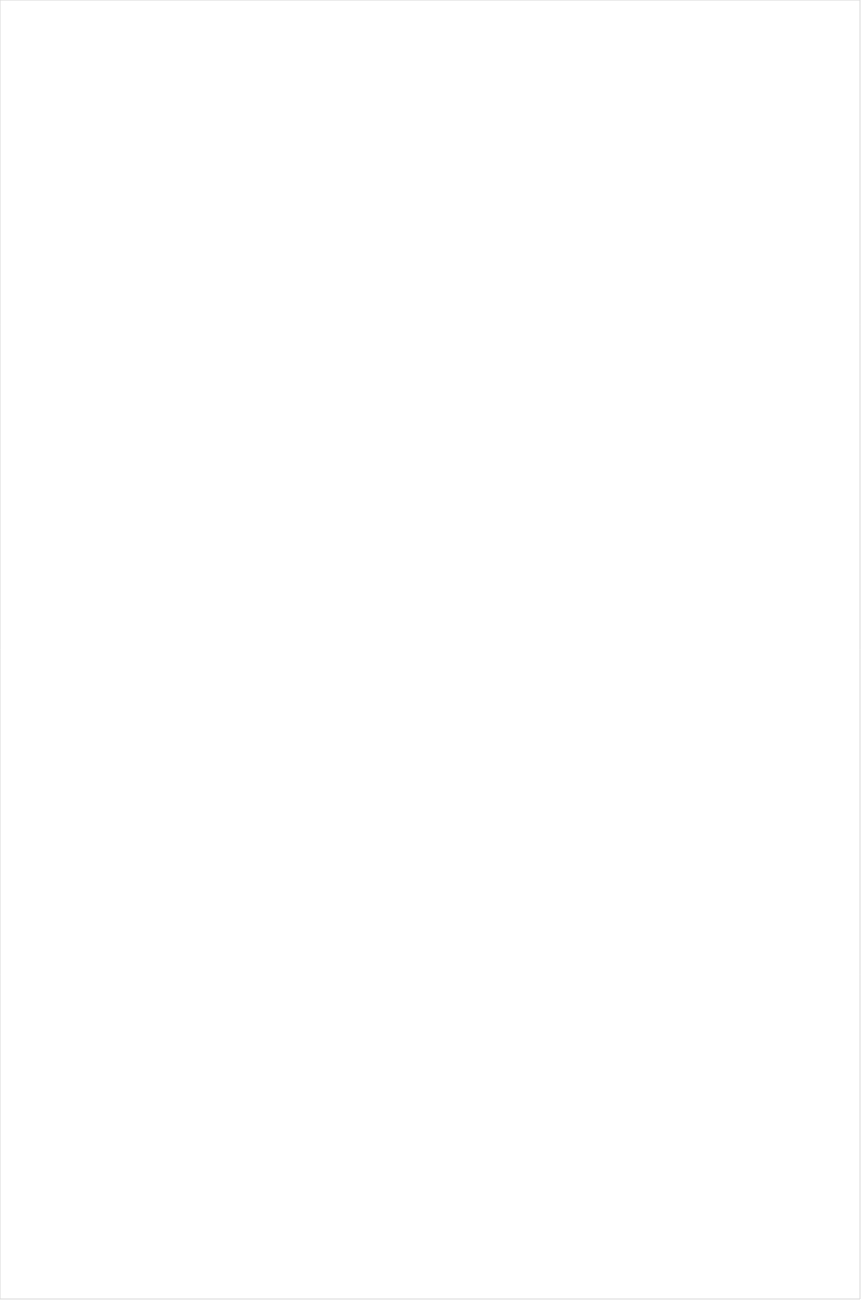
| Category | Total |
|---|---|
| UniMas | -0.543 |
| Hallmark Movies & Mysteries | -0.542 |
| Univision | -0.48 |
| RFD TV | -0.46 |
| Hallmark | -0.444 |
| Telemundo | -0.41 |
| Travel | -0.374 |
| PBS | -0.361 |
| National Geographic Wild | -0.343 |
| Galavision | -0.324 |
| UP TV | -0.276 |
| Science Channel | -0.273 |
| CMTV | -0.256 |
| MyNetworkTV | -0.236 |
| Fox News | -0.234 |
| Fox Business | -0.203 |
| The Sportsman Channel | -0.202 |
| CBS | -0.186 |
| Outdoor Channel | -0.174 |
| NBC Universo | -0.168 |
| Animal Planet | -0.165 |
| Weather Channel | -0.164 |
| TLC | -0.161 |
| Great American Country | -0.159 |
| INSP | -0.151 |
| ION | -0.143 |
| History Channel | -0.14 |
| Smithsonian | -0.131 |
| WGN America | -0.113 |
| Investigation Discovery | -0.108 |
| NBC | -0.105 |
| Cartoon Network | -0.105 |
| POP | -0.076 |
| Ovation | -0.07 |
| Discovery Life Channel | -0.066 |
| TV LAND | -0.06 |
| Discovery Channel | -0.058 |
| DIY | -0.055 |
| HGTV | -0.049 |
| Headline News | -0.048 |
| Discovery Family Channel | -0.044 |
| CW | -0.027 |
| Motor Trend Network | 0.002 |
| ABC | 0.011 |
| OXYGEN | 0.012 |
| FYI | 0.014 |
| FOX | 0.02 |
| Freeform | 0.035 |
| Nick@Nite | 0.07 |
| American Heroes Channel | 0.079 |
| Disney XD | 0.087 |
| Nick Toons | 0.09 |
| E! | 0.116 |
| Lifetime Movies | 0.13 |
| Food Network | 0.136 |
| BBC America | 0.148 |
| WE TV | 0.152 |
| Disney Junior US | 0.159 |
| BRAVO | 0.162 |
| Universal Kids | 0.162 |
| Destination America | 0.171 |
| SYFY | 0.173 |
| Nick Jr. | 0.178 |
| National Geographic | 0.182 |
| Disney Channel | 0.193 |
| Nick | 0.193 |
| A&E | 0.203 |
| SundanceTV | 0.203 |
| Teen Nick | 0.208 |
| Adult Swim | 0.21 |
| Lifetime | 0.21 |
| TUDN | 0.214 |
| AMC | 0.218 |
| Logo | 0.222 |
| TBS | 0.246 |
| NHL | 0.247 |
| Reelz Channel | 0.29 |
| Paramount Network | 0.313 |
| Game Show | 0.345 |
| MTV | 0.349 |
| MSNBC | 0.37 |
| Bloomberg HD | 0.379 |
| FX | 0.386 |
| Cooking Channel | 0.39 |
| Independent Film (IFC) | 0.402 |
| Oprah Winfrey Network | 0.406 |
| USA Network | 0.416 |
| truTV | 0.457 |
| FX Movie Channel | 0.464 |
| CNBC | 0.481 |
| Comedy Central | 0.548 |
| FXX | 0.561 |
| Viceland | 0.693 |
| TNT | 0.743 |
| CNN | 0.774 |
| ESPN Deportes | 0.846 |
| Olympic Channel | 0.883 |
| Golf | 1.042 |
| FXDEP | 1.091 |
| BET | 1.17 |
| VH1 | 1.213 |
| MLB Network | 1.263 |
| CBS Sports | 1.387 |
| Tennis Channel | 1.396 |
| BET Her | 1.467 |
| Big Ten Network | 1.562 |
| MTV2 | 1.623 |
| TV ONE | 1.663 |
| Fox Sports 1 | 1.758 |
| PAC-12 Network | 2.08 |
| ESPNEWS | 2.261 |
| NBC Sports | 2.467 |
| NFL Network | 2.694 |
| ESPNU | 2.909 |
| ESPN2 | 4.016 |
| ESPN | 4.569 |
| NBA TV | 7.39 |